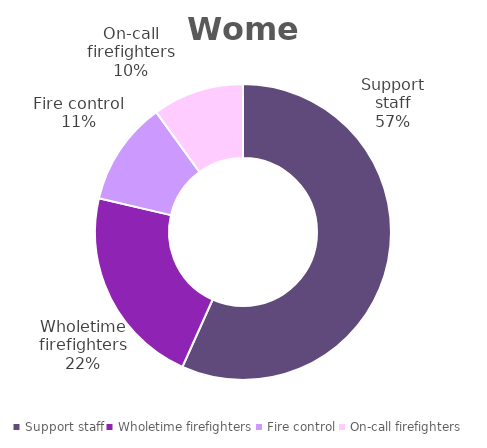
| Category | Women |
|---|---|
| Support staff | 0.567 |
| Wholetime firefighters | 0.219 |
| Fire control | 0.114 |
| On-call firefighters | 0.1 |